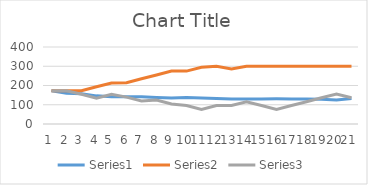
| Category | Series 0 | Series 1 | Series 2 |
|---|---|---|---|
| 0 | 173 | 173 | 173 |
| 1 | 159.791 | 172.728 | 172.437 |
| 2 | 157.595 | 173.121 | 154.243 |
| 3 | 146.181 | 193.121 | 134.243 |
| 4 | 141.527 | 213.121 | 154.243 |
| 5 | 141.446 | 214.684 | 139.623 |
| 6 | 141.589 | 234.684 | 119.623 |
| 7 | 137.949 | 254.684 | 124.408 |
| 8 | 135.074 | 274.684 | 104.408 |
| 9 | 137.554 | 274.737 | 95.911 |
| 10 | 134.949 | 294.737 | 75.911 |
| 11 | 132.81 | 300 | 95.911 |
| 12 | 130.133 | 286.386 | 95.97 |
| 13 | 130.074 | 300 | 115.97 |
| 14 | 130.128 | 300 | 95.97 |
| 15 | 131.05 | 300 | 75.97 |
| 16 | 130.409 | 300 | 95.97 |
| 17 | 129.299 | 300 | 115.97 |
| 18 | 128.475 | 300 | 135.97 |
| 19 | 124.749 | 300 | 155.97 |
| 20 | 132.564 | 300 | 135.97 |